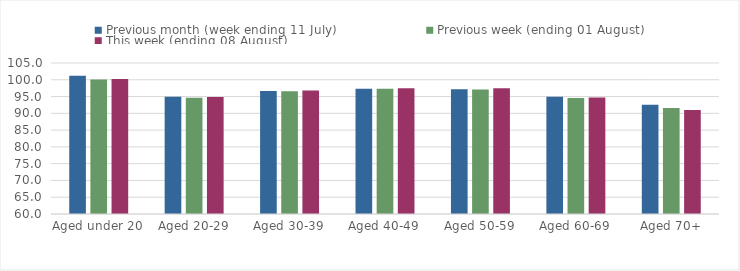
| Category | Previous month (week ending 11 July) | Previous week (ending 01 August) | This week (ending 08 August) |
|---|---|---|---|
| Aged under 20 | 101.164 | 100.06 | 100.249 |
| Aged 20-29 | 94.906 | 94.608 | 94.831 |
| Aged 30-39 | 96.646 | 96.591 | 96.828 |
| Aged 40-49 | 97.293 | 97.293 | 97.493 |
| Aged 50-59 | 97.208 | 97.112 | 97.448 |
| Aged 60-69 | 94.937 | 94.54 | 94.7 |
| Aged 70+ | 92.542 | 91.597 | 90.977 |